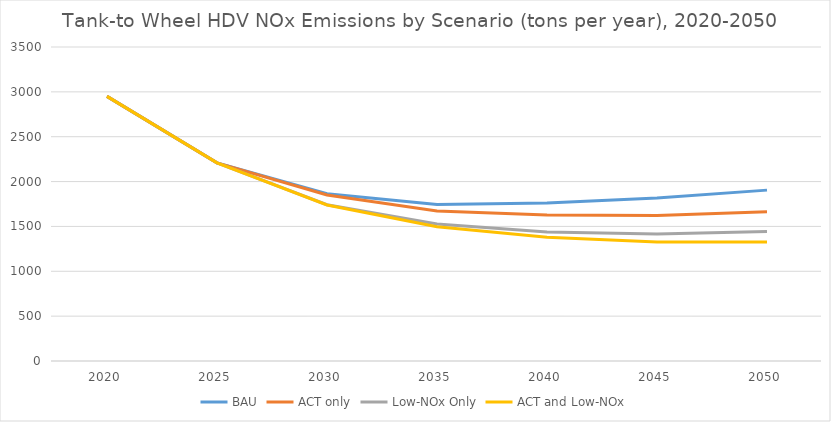
| Category | BAU | ACT only | Low-NOx Only | ACT and Low-NOx |
|---|---|---|---|---|
| 2020.0 | 2949.268 | 2949.268 | 2949.268 | 2949.268 |
| 2025.0 | 2208.899 | 2208.899 | 2208.899 | 2208.899 |
| 2030.0 | 1865.36 | 1849.904 | 1741.518 | 1739.109 |
| 2035.0 | 1743.97 | 1672.303 | 1525.954 | 1497.359 |
| 2040.0 | 1761.266 | 1626.188 | 1438.289 | 1378.506 |
| 2045.0 | 1816.31 | 1622.74 | 1416.344 | 1326.153 |
| 2050.0 | 1904.673 | 1662.404 | 1443.043 | 1327.595 |